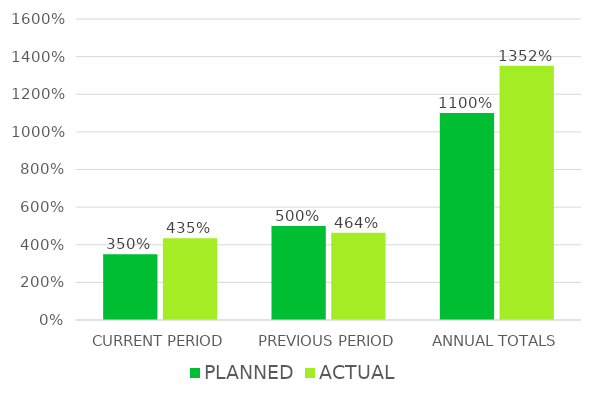
| Category | PLANNED | ACTUAL |
|---|---|---|
| CURRENT PERIOD | 3.5 | 4.348 |
| PREVIOUS PERIOD | 5 | 4.642 |
| ANNUAL TOTALS | 11 | 13.52 |